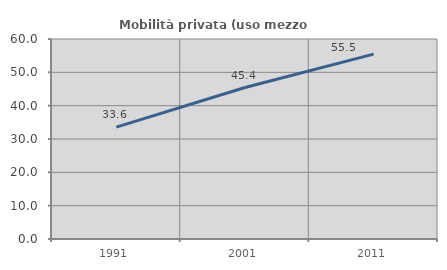
| Category | Mobilità privata (uso mezzo privato) |
|---|---|
| 1991.0 | 33.566 |
| 2001.0 | 45.433 |
| 2011.0 | 55.476 |